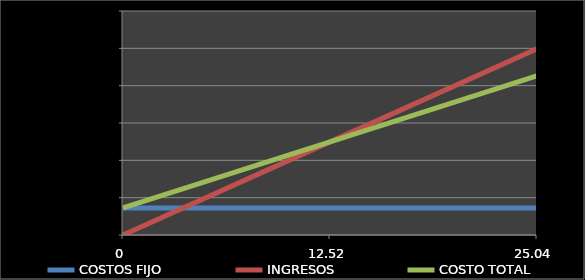
| Category | COSTOS FIJO | INGRESOS | COSTO TOTAL |
|---|---|---|---|
| 0.0 | 36200000 | 0 | 36200000 |
| 12.520995278123774 | 36200000 | 124756647.099 | 124756647.099 |
| 25.041990556247548 | 36200000 | 249513294.197 | 213313294.197 |